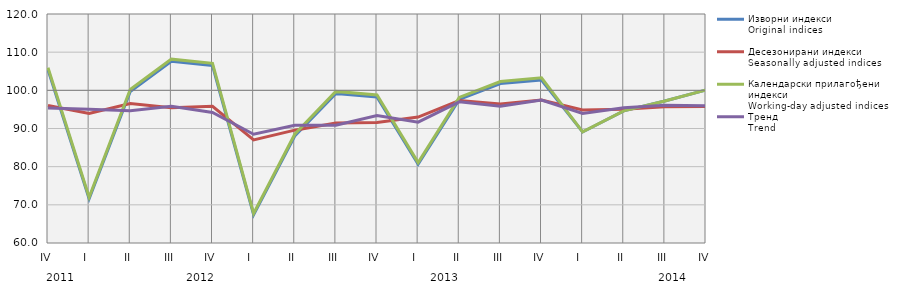
| Category | Изворни индекси
Original indices | Десезонирани индекси
Seasonally adjusted indices | Календарски прилагођени индекси
Working-day adjusted indices | Тренд
Trend |
|---|---|---|---|---|
| IV | 105.376 | 96.041 | 105.939 | 95.396 |
| I  | 71.601 | 93.964 | 71.98 | 95.025 |
| II | 99.705 | 96.544 | 100.233 | 94.677 |
| III | 107.6 | 95.431 | 108.174 | 95.832 |
| IV | 106.508 | 95.807 | 107.07 | 94.207 |
| I  | 67.411 | 87.023 | 67.77 | 88.492 |
| II | 88.026 | 89.566 | 88.493 | 90.865 |
| III | 99.2 | 91.463 | 99.724 | 90.839 |
| IV | 98.255 | 91.57 | 98.774 | 93.41 |
| I  | 80.624 | 92.997 | 81.053 | 91.672 |
| II | 97.612 | 97.312 | 98.129 | 97 |
| III | 101.777 | 96.417 | 102.315 | 95.828 |
| IV | 102.721 | 97.439 | 103.264 | 97.453 |
| I  | 89.092 | 94.844 | 89.094 | 93.955 |
| II | 94.609 | 95.071 | 94.609 | 95.421 |
| III | 97.218 | 95.692 | 97.217 | 96.086 |
| IV | 100.076 | 95.769 | 100.075 | 95.99 |